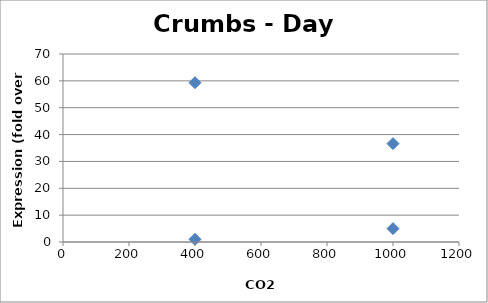
| Category | Series 0 |
|---|---|
| 1000.0 | 4.988 |
| 1000.0 | 36.618 |
| 400.0 | 1 |
| 400.0 | 59.315 |